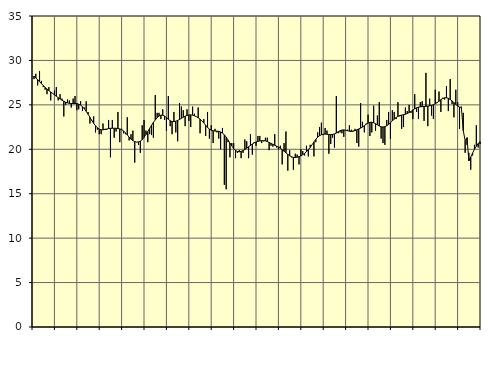
| Category | Piggar | Series 1 |
|---|---|---|
| nan | 27.9 | 28.25 |
| 1.0 | 28.5 | 28.01 |
| 1.0 | 27.2 | 27.84 |
| 1.0 | 28.8 | 27.62 |
| 1.0 | 27.7 | 27.4 |
| 1.0 | 27 | 27.17 |
| 1.0 | 26.7 | 26.97 |
| 1.0 | 26.2 | 26.78 |
| 1.0 | 27 | 26.61 |
| 1.0 | 25.5 | 26.45 |
| 1.0 | 26.3 | 26.29 |
| 1.0 | 26.6 | 26.13 |
| nan | 27 | 25.97 |
| 2.0 | 25.5 | 25.81 |
| 2.0 | 26.2 | 25.66 |
| 2.0 | 25.7 | 25.53 |
| 2.0 | 23.7 | 25.4 |
| 2.0 | 25 | 25.3 |
| 2.0 | 25.6 | 25.22 |
| 2.0 | 25.5 | 25.17 |
| 2.0 | 24.7 | 25.16 |
| 2.0 | 25.7 | 25.15 |
| 2.0 | 26 | 25.16 |
| 2.0 | 24.4 | 25.14 |
| nan | 24.5 | 25.08 |
| 3.0 | 25.4 | 24.97 |
| 3.0 | 24.3 | 24.79 |
| 3.0 | 24.7 | 24.56 |
| 3.0 | 25.4 | 24.27 |
| 3.0 | 24.2 | 23.95 |
| 3.0 | 22.9 | 23.6 |
| 3.0 | 23.2 | 23.25 |
| 3.0 | 23.7 | 22.92 |
| 3.0 | 21.9 | 22.65 |
| 3.0 | 22.2 | 22.42 |
| 3.0 | 21.7 | 22.27 |
| nan | 21.7 | 22.2 |
| 4.0 | 22.9 | 22.19 |
| 4.0 | 22.3 | 22.23 |
| 4.0 | 22.2 | 22.28 |
| 4.0 | 23.3 | 22.33 |
| 4.0 | 19.1 | 22.36 |
| 4.0 | 23.3 | 22.37 |
| 4.0 | 21.3 | 22.37 |
| 4.0 | 22 | 22.36 |
| 4.0 | 24.2 | 22.34 |
| 4.0 | 20.8 | 22.29 |
| 4.0 | 22.3 | 22.21 |
| nan | 21.8 | 22.06 |
| 5.0 | 21.7 | 21.86 |
| 5.0 | 23.6 | 21.62 |
| 5.0 | 21 | 21.37 |
| 5.0 | 21.7 | 21.14 |
| 5.0 | 22.1 | 20.98 |
| 5.0 | 18.5 | 20.87 |
| 5.0 | 20.8 | 20.81 |
| 5.0 | 20.5 | 20.83 |
| 5.0 | 19.6 | 20.92 |
| 5.0 | 22.7 | 21.09 |
| 5.0 | 23.3 | 21.34 |
| nan | 22.1 | 21.66 |
| 6.0 | 20.8 | 22 |
| 6.0 | 21.7 | 22.36 |
| 6.0 | 21.6 | 22.7 |
| 6.0 | 21.3 | 23.02 |
| 6.0 | 26.1 | 23.3 |
| 6.0 | 24.1 | 23.56 |
| 6.0 | 24.1 | 23.75 |
| 6.0 | 23.4 | 23.84 |
| 6.0 | 24.5 | 23.83 |
| 6.0 | 23.3 | 23.73 |
| 6.0 | 22.1 | 23.56 |
| nan | 26 | 23.37 |
| 7.0 | 22.6 | 23.21 |
| 7.0 | 21.7 | 23.12 |
| 7.0 | 24.2 | 23.11 |
| 7.0 | 21.9 | 23.16 |
| 7.0 | 20.9 | 23.25 |
| 7.0 | 25.2 | 23.36 |
| 7.0 | 24.8 | 23.48 |
| 7.0 | 24.4 | 23.61 |
| 7.0 | 22.6 | 23.72 |
| 7.0 | 24.5 | 23.81 |
| 7.0 | 23.2 | 23.87 |
| nan | 22.5 | 23.87 |
| 8.0 | 24.8 | 23.84 |
| 8.0 | 24 | 23.77 |
| 8.0 | 23.7 | 23.67 |
| 8.0 | 24.7 | 23.55 |
| 8.0 | 21.8 | 23.39 |
| 8.0 | 23.2 | 23.2 |
| 8.0 | 23.4 | 22.96 |
| 8.0 | 21.5 | 22.7 |
| 8.0 | 24.2 | 22.46 |
| 8.0 | 21.2 | 22.28 |
| 8.0 | 22.7 | 22.15 |
| nan | 20.7 | 22.08 |
| 9.0 | 22.3 | 22.06 |
| 9.0 | 21.9 | 22.04 |
| 9.0 | 21.2 | 22.02 |
| 9.0 | 20 | 21.95 |
| 9.0 | 22.4 | 21.82 |
| 9.0 | 16 | 21.63 |
| 9.0 | 15.5 | 21.37 |
| 9.0 | 20.8 | 21.05 |
| 9.0 | 19.1 | 20.7 |
| 9.0 | 20.7 | 20.37 |
| 9.0 | 20.7 | 20.08 |
| nan | 19 | 19.87 |
| 10.0 | 19.6 | 19.75 |
| 10.0 | 19.9 | 19.72 |
| 10.0 | 19 | 19.76 |
| 10.0 | 19.6 | 19.85 |
| 10.0 | 21.1 | 19.98 |
| 10.0 | 20.9 | 20.13 |
| 10.0 | 19 | 20.28 |
| 10.0 | 21.7 | 20.44 |
| 10.0 | 19.4 | 20.59 |
| 10.0 | 20.8 | 20.72 |
| 10.0 | 20.4 | 20.82 |
| nan | 21.5 | 20.89 |
| 11.0 | 21.5 | 20.94 |
| 11.0 | 20.7 | 20.97 |
| 11.0 | 20.9 | 20.97 |
| 11.0 | 21.3 | 20.94 |
| 11.0 | 21.3 | 20.87 |
| 11.0 | 19.9 | 20.77 |
| 11.0 | 20.4 | 20.66 |
| 11.0 | 20.3 | 20.56 |
| 11.0 | 21.7 | 20.45 |
| 11.0 | 20.2 | 20.35 |
| 11.0 | 20 | 20.24 |
| nan | 20.4 | 20.11 |
| 12.0 | 18.3 | 19.95 |
| 12.0 | 20.7 | 19.78 |
| 12.0 | 22 | 19.6 |
| 12.0 | 17.6 | 19.43 |
| 12.0 | 19.9 | 19.27 |
| 12.0 | 19.1 | 19.15 |
| 12.0 | 17.7 | 19.09 |
| 12.0 | 19.5 | 19.07 |
| 12.0 | 19.4 | 19.11 |
| 12.0 | 18.3 | 19.17 |
| 12.0 | 20 | 19.26 |
| nan | 19.8 | 19.39 |
| 13.0 | 19.3 | 19.54 |
| 13.0 | 20.4 | 19.73 |
| 13.0 | 19.2 | 19.95 |
| 13.0 | 20.5 | 20.21 |
| 13.0 | 20.5 | 20.51 |
| 13.0 | 19.2 | 20.83 |
| 13.0 | 20.8 | 21.12 |
| 13.0 | 21.9 | 21.36 |
| 13.0 | 22.5 | 21.53 |
| 13.0 | 23 | 21.64 |
| 13.0 | 21.6 | 21.7 |
| nan | 22.4 | 21.71 |
| 14.0 | 22.1 | 21.69 |
| 14.0 | 19.5 | 21.67 |
| 14.0 | 20.6 | 21.66 |
| 14.0 | 21.3 | 21.68 |
| 14.0 | 20.2 | 21.73 |
| 14.0 | 26 | 21.83 |
| 14.0 | 21.8 | 21.97 |
| 14.0 | 21.9 | 22.09 |
| 14.0 | 21.8 | 22.17 |
| 14.0 | 21.4 | 22.18 |
| 14.0 | 22.1 | 22.15 |
| nan | 22.2 | 22.09 |
| 15.0 | 22.7 | 22.03 |
| 15.0 | 22.2 | 22 |
| 15.0 | 22.1 | 22.03 |
| 15.0 | 22.3 | 22.1 |
| 15.0 | 20.7 | 22.19 |
| 15.0 | 20.3 | 22.29 |
| 15.0 | 25.2 | 22.38 |
| 15.0 | 23.1 | 22.5 |
| 15.0 | 21.9 | 22.66 |
| 15.0 | 22.9 | 22.82 |
| 15.0 | 23.9 | 22.95 |
| nan | 21.5 | 23.03 |
| 16.0 | 21.9 | 23.05 |
| 16.0 | 24.9 | 22.99 |
| 16.0 | 22.1 | 22.88 |
| 16.0 | 23.8 | 22.75 |
| 16.0 | 25.3 | 22.62 |
| 16.0 | 21.2 | 22.53 |
| 16.0 | 20.7 | 22.51 |
| 16.0 | 20.5 | 22.55 |
| 16.0 | 23.3 | 22.65 |
| 16.0 | 24.2 | 22.8 |
| 16.0 | 21.2 | 22.99 |
| nan | 24.4 | 23.19 |
| 17.0 | 24.2 | 23.4 |
| 17.0 | 23.4 | 23.57 |
| 17.0 | 25.3 | 23.71 |
| 17.0 | 23.7 | 23.8 |
| 17.0 | 22.3 | 23.85 |
| 17.0 | 22.5 | 23.89 |
| 17.0 | 24.7 | 23.94 |
| 17.0 | 24.3 | 24.03 |
| 17.0 | 25 | 24.13 |
| 17.0 | 24.1 | 24.26 |
| 17.0 | 23.4 | 24.41 |
| nan | 26.2 | 24.55 |
| 18.0 | 24.2 | 24.67 |
| 18.0 | 23.4 | 24.74 |
| 18.0 | 25.3 | 24.78 |
| 18.0 | 25.4 | 24.8 |
| 18.0 | 23.2 | 24.81 |
| 18.0 | 28.6 | 24.83 |
| 18.0 | 22.6 | 24.86 |
| 18.0 | 25.7 | 24.89 |
| 18.0 | 23.8 | 24.94 |
| 18.0 | 23.4 | 25.02 |
| 18.0 | 26.7 | 25.13 |
| nan | 25.2 | 25.26 |
| 19.0 | 26.5 | 25.41 |
| 19.0 | 24.2 | 25.58 |
| 19.0 | 25.8 | 25.71 |
| 19.0 | 25.6 | 25.79 |
| 19.0 | 27.1 | 25.8 |
| 19.0 | 24.3 | 25.74 |
| 19.0 | 27.9 | 25.6 |
| 19.0 | 25.1 | 25.44 |
| 19.0 | 23.6 | 25.25 |
| 19.0 | 26.7 | 25.05 |
| 19.0 | 25.3 | 24.87 |
| nan | 22.3 | 24.74 |
| 20.0 | 24.8 | 24.7 |
| 20.0 | 24.1 | 22.09 |
| 20.0 | 19.6 | 20.99 |
| 20.0 | 20.5 | 21.3 |
| 20.0 | 19.6 | 18.7 |
| 20.0 | 17.7 | 19.13 |
| 20.0 | 19.3 | 19.58 |
| 20.0 | 20.5 | 19.99 |
| 20.0 | 22.7 | 20.35 |
| 20.0 | 20.2 | 20.65 |
| 20.0 | 20.6 | 20.86 |